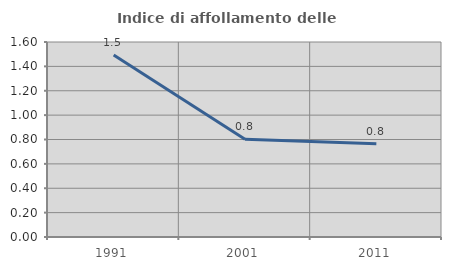
| Category | Indice di affollamento delle abitazioni  |
|---|---|
| 1991.0 | 1.493 |
| 2001.0 | 0.802 |
| 2011.0 | 0.765 |